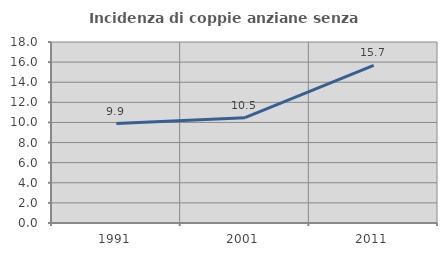
| Category | Incidenza di coppie anziane senza figli  |
|---|---|
| 1991.0 | 9.89 |
| 2001.0 | 10.476 |
| 2011.0 | 15.686 |